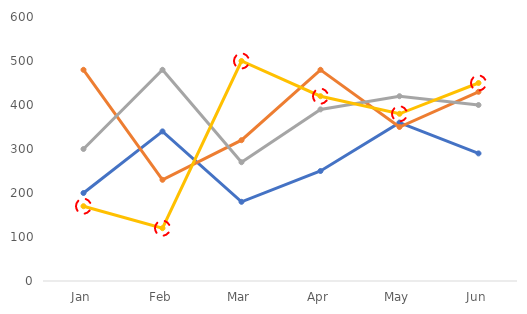
| Category | 2016 | 2017 | 2018 | 2019 |
|---|---|---|---|---|
| Jan |  |  |  | 170 |
| Feb |  |  |  | 120 |
| Mar |  |  |  | 500 |
| Apr |  |  |  | 420 |
| May |  |  |  | 380 |
| Jun |  |  |  | 450 |